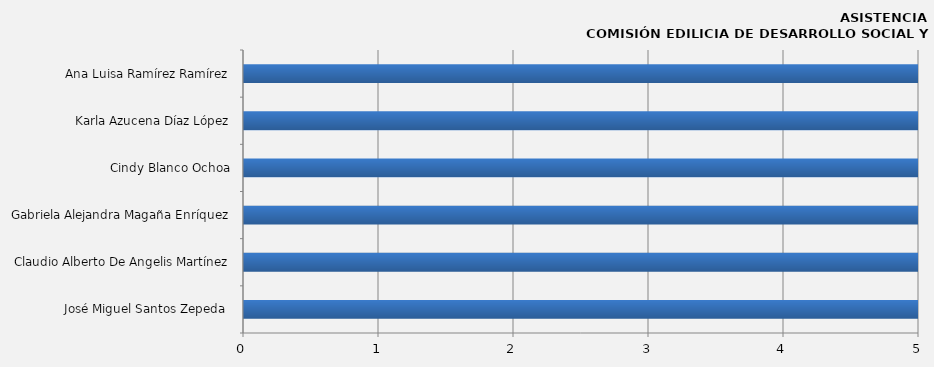
| Category | Series 0 |
|---|---|
| José Miguel Santos Zepeda  | 10 |
| Claudio Alberto De Angelis Martínez | 8 |
| Gabriela Alejandra Magaña Enríquez | 8 |
| Cindy Blanco Ochoa | 7 |
| Karla Azucena Díaz López | 8 |
| Ana Luisa Ramírez Ramírez | 7 |